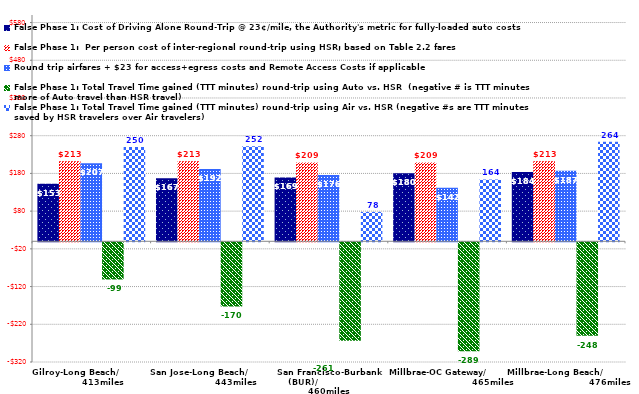
| Category | False Phase 1: Cost of Driving Alone Round-Trip @ 23¢/mile, the Authority's metric for fully-loaded auto costs | False Phase 1:  Per person cost of inter-regional round-trip using HSR; based on Table 2.2 fares | Round trip airfares + $23 for access+egress costs and Remote Access Costs if applicable | False Phase 1: Total Travel Time gained (TTT minutes) round-trip using Auto vs. HSR  (negative # is TTT minutes more of Auto travel than HSR travel) | False Phase 1: Total Travel Time gained (TTT minutes) round-trip using Air vs. HSR (negative #s are TTT minutes saved by HSR travelers over Air travelers) |
|---|---|---|---|---|---|
| Gilroy-Long Beach/                    413miles | 152.72 | 212.5 | 207 | -98.5 | 250 |
| San Jose-Long Beach/                         443miles | 166.98 | 212.5 | 192 | -170.1 | 252 |
| San Francisco-Burbank (BUR)/                    460miles | 169.28 | 209 | 176 | -260.9 | 78 |
| Millbrae-OC Gateway/                                    465miles | 180.32 | 209 | 142 | -288.8 | 164 |
| Millbrae-Long Beach/                                    476miles | 184 | 212.5 | 187 | -248 | 264 |